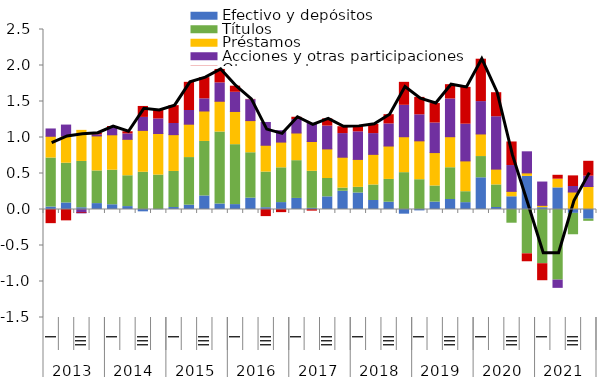
| Category | Efectivo y depósitos | Títulos | Préstamos  | Acciones y otras participaciones  | Otras cuentas |
|---|---|---|---|---|---|
| 0 | 0.034 | 0.681 | 0.302 | 0.101 | -0.197 |
| 1 | 0.091 | 0.552 | 0.378 | 0.152 | -0.158 |
| 2 | 0.024 | 0.643 | 0.432 | -0.047 | -0.009 |
| 3 | 0.082 | 0.454 | 0.486 | 0.015 | 0.023 |
| 4 | 0.066 | 0.48 | 0.492 | 0.101 | 0.014 |
| 5 | 0.04 | 0.428 | 0.506 | 0.075 | 0.03 |
| 6 | -0.032 | 0.517 | 0.582 | 0.18 | 0.152 |
| 7 | -0.004 | 0.478 | 0.577 | 0.203 | 0.122 |
| 8 | 0.027 | 0.501 | 0.511 | 0.155 | 0.248 |
| 9 | 0.06 | 0.661 | 0.464 | 0.19 | 0.391 |
| 10 | 0.188 | 0.757 | 0.423 | 0.169 | 0.294 |
| 11 | 0.076 | 1 | 0.427 | 0.255 | 0.187 |
| 12 | 0.068 | 0.832 | 0.461 | 0.266 | 0.085 |
| 13 | 0.158 | 0.63 | 0.447 | 0.29 | 0.004 |
| 14 | 0.025 | 0.495 | 0.373 | 0.316 | -0.099 |
| 15 | 0.096 | 0.483 | 0.358 | 0.158 | -0.044 |
| 16 | 0.154 | 0.524 | 0.384 | 0.187 | 0.032 |
| 17 | 0.015 | 0.515 | 0.414 | 0.253 | -0.023 |
| 18 | 0.176 | 0.255 | 0.411 | 0.317 | 0.099 |
| 19 | 0.253 | 0.044 | 0.429 | 0.328 | 0.095 |
| 20 | 0.229 | 0.079 | 0.388 | 0.383 | 0.076 |
| 21 | 0.125 | 0.215 | 0.426 | 0.288 | 0.128 |
| 22 | 0.101 | 0.317 | 0.464 | 0.307 | 0.128 |
| 23 | -0.065 | 0.512 | 0.499 | 0.437 | 0.319 |
| 24 | -0.019 | 0.414 | 0.54 | 0.361 | 0.242 |
| 25 | 0.103 | 0.223 | 0.464 | 0.411 | 0.27 |
| 26 | 0.139 | 0.441 | 0.431 | 0.524 | 0.198 |
| 27 | 0.095 | 0.152 | 0.428 | 0.51 | 0.511 |
| 28 | 0.44 | 0.295 | 0.314 | 0.449 | 0.589 |
| 29 | 0.028 | 0.314 | 0.22 | 0.727 | 0.334 |
| 30 | 0.176 | -0.191 | 0.076 | 0.358 | 0.327 |
| 31 | 0.46 | -0.616 | 0.049 | 0.293 | -0.11 |
| 32 | 0.025 | -0.753 | 0.033 | 0.324 | -0.236 |
| 33 | 0.3 | -0.981 | 0.121 | -0.101 | 0.054 |
| 34 | -0.054 | -0.297 | 0.243 | 0.077 | 0.148 |
| 35 | -0.134 | -0.03 | 0.319 | 0.143 | 0.207 |